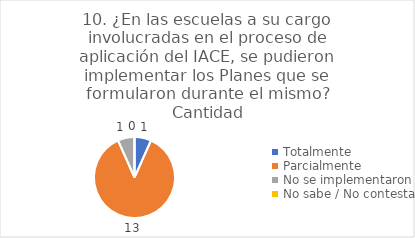
| Category | 10. ¿En las escuelas a su cargo involucradas en el proceso de aplicación del IACE, se pudieron implementar los Planes que se formularon durante el mismo? |
|---|---|
| Totalmente  | 0.067 |
| Parcialmente  | 0.867 |
| No se implementaron  | 0.067 |
| No sabe / No contesta | 0 |